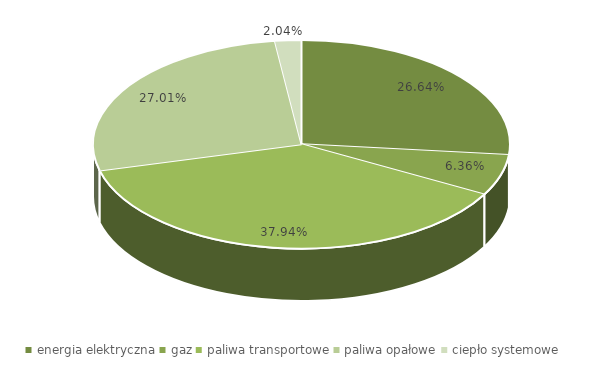
| Category | prognoza 2020 z inwestycjami oszczędnościowymi* |
|---|---|
| energia elektryczna | 0.266 |
| gaz | 0.064 |
| paliwa transportowe | 0.379 |
| paliwa opałowe | 0.27 |
| ciepło systemowe | 0.02 |